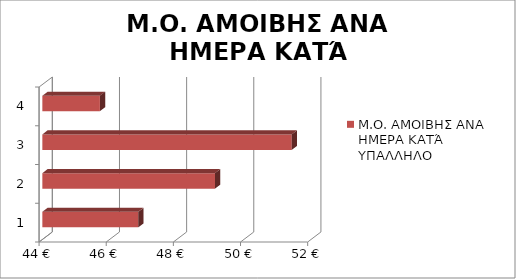
| Category | Μ.Ο. ΑΜΟΙΒΗΣ ΑΝΑ ΗΜΕΡΑ ΚΑΤΆ ΥΠΑΛΛΗΛΟ |
|---|---|
| 0 | 46.857 |
| 1 | 49.143 |
| 2 | 51.429 |
| 3 | 45.714 |